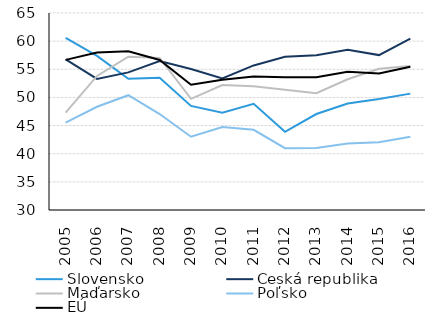
| Category | Slovensko | Česká republika | Maďarsko | Poľsko | EÚ |
|---|---|---|---|---|---|
| 2005.0 | 60.569 | 56.748 | 47.29 | 45.51 | 56.673 |
| 2006.0 | 57.385 | 53.296 | 53.823 | 48.337 | 57.968 |
| 2007.0 | 53.329 | 54.452 | 57.247 | 50.396 | 58.209 |
| 2008.0 | 53.481 | 56.477 | 57.03 | 47.049 | 56.646 |
| 2009.0 | 48.491 | 55.047 | 49.747 | 43.024 | 52.243 |
| 2010.0 | 47.281 | 53.357 | 52.211 | 44.728 | 53.149 |
| 2011.0 | 48.863 | 55.687 | 51.978 | 44.247 | 53.729 |
| 2012.0 | 43.895 | 57.242 | 51.356 | 40.988 | 53.585 |
| 2013.0 | 47.049 | 57.509 | 50.738 | 41.032 | 53.579 |
| 2014.0 | 48.917 | 58.473 | 53.221 | 41.809 | 54.543 |
| 2015.0 | 49.73 | 57.519 | 55.096 | 42.034 | 54.272 |
| 2016.0 | 50.677 | 60.439 | 55.564 | 42.996 | 55.462 |